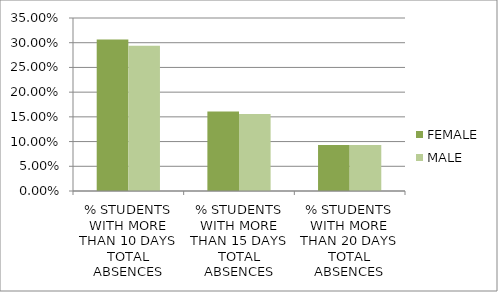
| Category | FEMALE | MALE |
|---|---|---|
| % STUDENTS WITH MORE THAN 10 DAYS TOTAL ABSENCES | 0.306 | 0.294 |
| % STUDENTS WITH MORE THAN 15 DAYS TOTAL ABSENCES | 0.161 | 0.156 |
| % STUDENTS WITH MORE THAN 20 DAYS TOTAL ABSENCES | 0.093 | 0.093 |